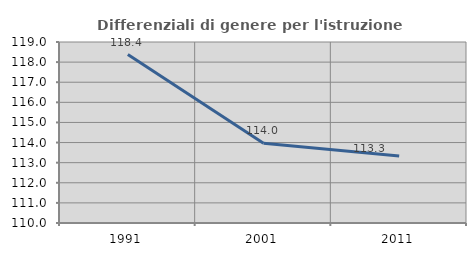
| Category | Differenziali di genere per l'istruzione superiore |
|---|---|
| 1991.0 | 118.378 |
| 2001.0 | 113.966 |
| 2011.0 | 113.334 |